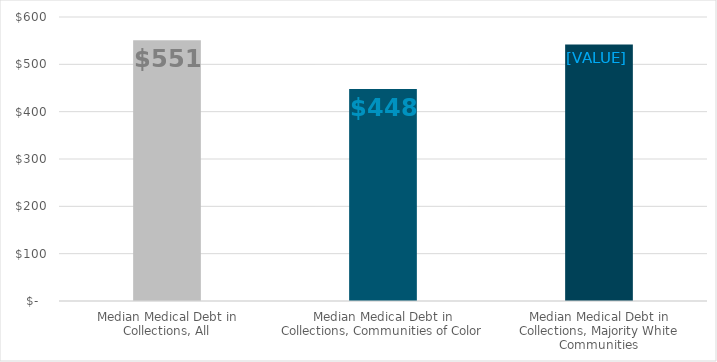
| Category | Washington |
|---|---|
| Median Medical Debt in Collections, All | 551 |
| Median Medical Debt in Collections, Communities of Color | 448 |
| Median Medical Debt in Collections, Majority White Communities | 542 |